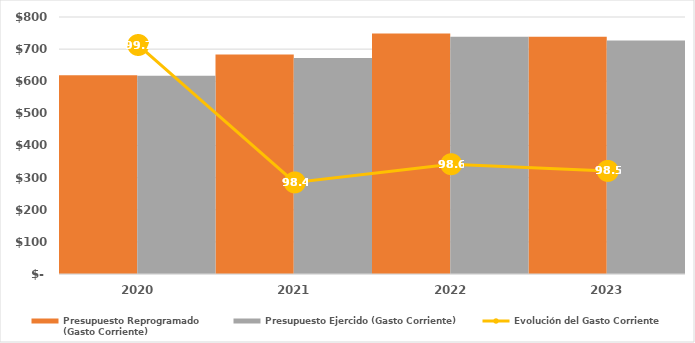
| Category | Presupuesto Reprogramado
(Gasto Corriente) | Presupuesto Ejercido (Gasto Corriente) |
|---|---|---|
| 2020.0 | 619034.656 | 617347.742 |
| 2021.0 | 683166.418 | 672172.234 |
| 2022.0 | 748930.345 | 738205.545 |
| 2023.0 | 738145.536 | 727093.545 |